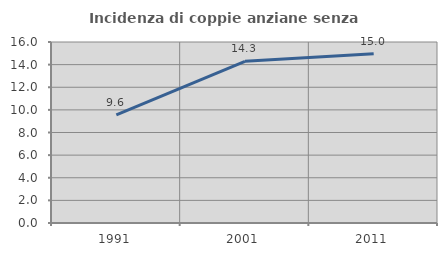
| Category | Incidenza di coppie anziane senza figli  |
|---|---|
| 1991.0 | 9.564 |
| 2001.0 | 14.293 |
| 2011.0 | 14.967 |